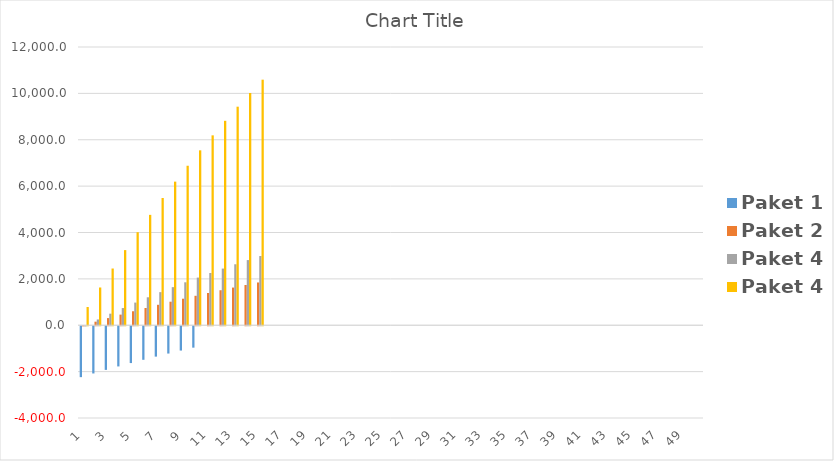
| Category | Paket 1 | Paket 2 | Paket 4 |
|---|---|---|---|
| 1.0 | -2195.053 | -4.913 | 786.007 |
| 2.0 | -2036.464 | 154.083 | 1628.688 |
| 3.0 | -1882.495 | 308.448 | 2446.825 |
| 4.0 | -1733.009 | 458.317 | 3241.132 |
| 5.0 | -1587.878 | 603.821 | 4012.304 |
| 6.0 | -1446.974 | 745.087 | 4761.015 |
| 7.0 | -1310.174 | 882.239 | 5487.919 |
| 8.0 | -1177.358 | 1015.396 | 6193.651 |
| 9.0 | -1048.411 | 1144.674 | 6878.827 |
| 10.0 | -923.219 | 1270.187 | 7544.047 |
| 11.0 | 0 | 1392.044 | 8189.892 |
| 12.0 | 0 | 1510.352 | 8816.926 |
| 13.0 | 0 | 1625.215 | 9425.696 |
| 14.0 | 0 | 1736.731 | 10016.735 |
| 15.0 | 0 | 1845 | 10590.56 |
| 16.0 | 0 | 0 | 0 |
| 17.0 | 0 | 0 | 0 |
| 18.0 | 0 | 0 | 0 |
| 19.0 | 0 | 0 | 0 |
| 20.0 | 0 | 0 | 0 |
| 21.0 | 0 | 0 | 0 |
| 22.0 | 0 | 0 | 0 |
| 23.0 | 0 | 0 | 0 |
| 24.0 | 0 | 0 | 0 |
| 25.0 | 0 | 0 | 0 |
| 26.0 | 0 | 0 | 0 |
| 27.0 | 0 | 0 | 0 |
| 28.0 | 0 | 0 | 0 |
| 29.0 | 0 | 0 | 0 |
| 30.0 | 0 | 0 | 0 |
| 31.0 | 0 | 0 | 0 |
| 32.0 | 0 | 0 | 0 |
| 33.0 | 0 | 0 | 0 |
| 34.0 | 0 | 0 | 0 |
| 35.0 | 0 | 0 | 0 |
| 36.0 | 0 | 0 | 0 |
| 37.0 | 0 | 0 | 0 |
| 38.0 | 0 | 0 | 0 |
| 39.0 | 0 | 0 | 0 |
| 40.0 | 0 | 0 | 0 |
| 41.0 | 0 | 0 | 0 |
| 42.0 | 0 | 0 | 0 |
| 43.0 | 0 | 0 | 0 |
| 44.0 | 0 | 0 | 0 |
| 45.0 | 0 | 0 | 0 |
| 46.0 | 0 | 0 | 0 |
| 47.0 | 0 | 0 | 0 |
| 48.0 | 0 | 0 | 0 |
| 49.0 | 0 | 0 | 0 |
| 50.0 | 0 | 0 | 0 |